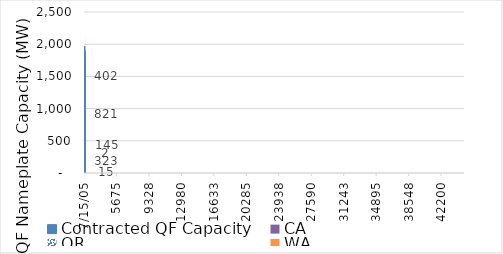
| Category | Contracted QF Capacity | CA | OR | WA | ID | UT | WY |
|---|---|---|---|---|---|---|---|
| 7/31/22 | 2172.736 | 0 | 0 | 0 | 0 | 0 | 0 |
| 7/15/05 | 1966.766 | 3.95 | 12.822 | 0 | 0 | 50.829 | 95.116 |
| 7/16/05 | 1905.236 | 3.95 | 18.865 | 0 | 0.205 | 93.109 | 95.195 |
| 7/17/05 | 1899.171 | 3.95 | 23.657 | 0 | 0.205 | 93.109 | 95.195 |
| 7/18/05 | 1884.453 | 3.95 | 32.386 | 0 | 0.205 | 95.928 | 95.274 |
| 7/19/05 | 1848.588 | 3.95 | 58.191 | 0 | 0.205 | 98.456 | 95.274 |
| 7/20/05 | 1846.708 | 3.95 | 59.677 | 0 | 0.205 | 98.456 | 95.274 |
| 7/21/05 | 1792.822 | 11.85 | 78.073 | 0 | 1.548 | 113.387 | 95.274 |
| 7/22/05 | 1719.352 | 11.85 | 135.885 | 0 | 1.778 | 113.387 | 95.274 |
| 7/23/05 | 1710.411 | 11.85 | 140.648 | 2.3 | 1.778 | 113.387 | 95.274 |
| 7/24/05 | 1624.911 | 11.85 | 172.643 | 2.3 | 37.328 | 113.387 | 95.274 |
| 7/25/05 | 1497.001 | 11.85 | 178.726 | 2.3 | 131.89 | 113.79 | 95.274 |
| 7/26/05 | 1351.401 | 15.168 | 178.726 | 2.3 | 132.443 | 113.79 | 206.427 |
| 7/27/05 | 1351.401 | 15.168 | 178.726 | 2.3 | 132.443 | 113.79 | 206.427 |
| 7/28/05 | 1258.41 | 15.208 | 184.063 | 2.3 | 132.823 | 181.497 | 206.427 |
| 7/29/05 | 242.89 | 15.208 | 282.987 | 2.3 | 133.534 | 820.923 | 269.627 |
| 7/30/05 | 225.99 | 15.208 | 291.598 | 2.3 | 138.274 | 820.923 | 269.627 |
| 7/31/05 | 115.79 | 15.208 | 291.756 | 2.3 | 138.274 | 820.923 | 356.527 |
| 8/1/05 | 18.19 | 15.208 | 323.356 | 2.3 | 138.274 | 820.923 | 402.031 |
| 8/2/05 | 18.03 | 15.334 | 323.356 | 2.3 | 138.274 | 820.923 | 402.031 |
| 8/3/05 | 10.13 | 15.334 | 323.356 | 2.3 | 144.515 | 820.923 | 402.031 |